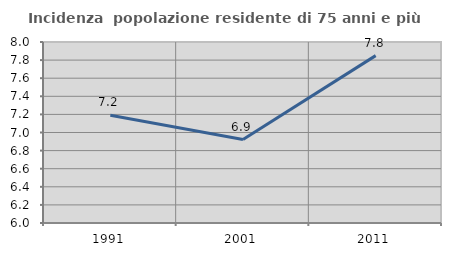
| Category | Incidenza  popolazione residente di 75 anni e più |
|---|---|
| 1991.0 | 7.19 |
| 2001.0 | 6.922 |
| 2011.0 | 7.85 |